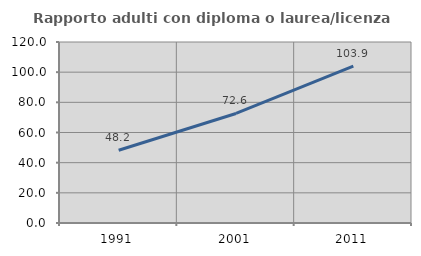
| Category | Rapporto adulti con diploma o laurea/licenza media  |
|---|---|
| 1991.0 | 48.241 |
| 2001.0 | 72.615 |
| 2011.0 | 103.939 |